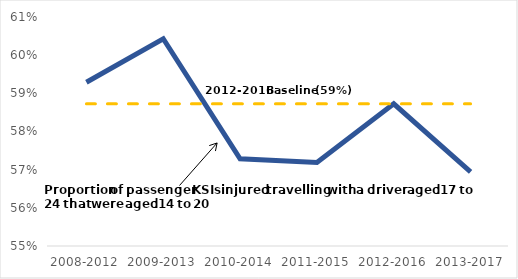
| Category | Series 0 | Series 1 |
|---|---|---|
| 2008-2012 | 0.593 | 0.587 |
| 2009-2013 | 0.604 | 0.587 |
| 2010-2014 | 0.573 | 0.587 |
| 2011-2015 | 0.572 | 0.587 |
| 2012-2016 | 0.587 | 0.587 |
| 2013-2017 | 0.569 | 0.587 |